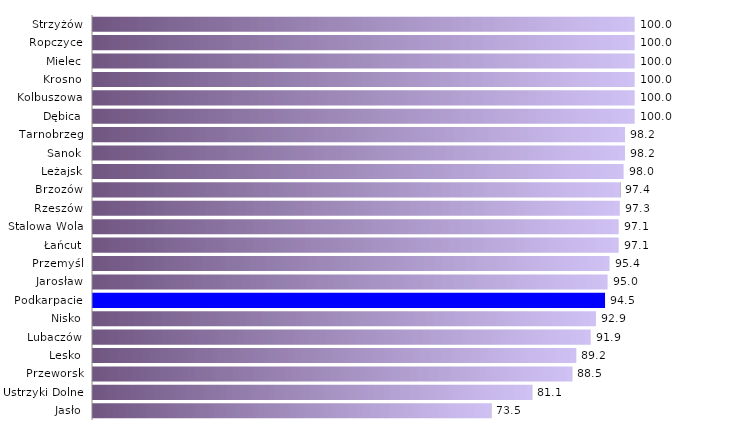
| Category | Bon na zasiedlenie |
|---|---|
| Jasło | 73.529 |
| Ustrzyki Dolne | 81.081 |
| Przeworsk | 88.462 |
| Lesko | 89.189 |
| Lubaczów | 91.892 |
| Nisko | 92.857 |
| Podkarpacie | 94.53 |
| Jarosław | 95 |
| Przemyśl | 95.37 |
| Łańcut | 97.059 |
| Stalowa Wola | 97.059 |
| Rzeszów | 97.26 |
| Brzozów | 97.368 |
| Leżajsk | 97.959 |
| Sanok | 98.214 |
| Tarnobrzeg | 98.214 |
| Dębica | 100 |
| Kolbuszowa | 100 |
| Krosno | 100 |
| Mielec | 100 |
| Ropczyce | 100 |
| Strzyżów | 100 |